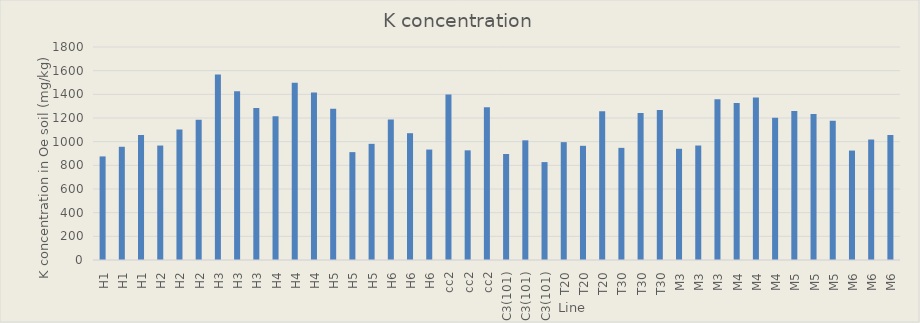
| Category | Series 0 |
|---|---|
| H1 | 875.34 |
| H1 | 956.953 |
| H1 | 1056.56 |
| H2 | 967.267 |
| H2 | 1102.268 |
| H2 | 1185.844 |
| H3 | 1567.822 |
| H3 | 1425.326 |
| H3 | 1283.853 |
| H4 | 1214.295 |
| H4 | 1497.702 |
| H4 | 1416.536 |
| H5 | 1278.962 |
| H5 | 911.667 |
| H5 | 981.686 |
| H6 | 1188.254 |
| H6 | 1071.49 |
| H6 | 933.397 |
| cc2 | 1398.912 |
| cc2 | 926.765 |
| cc2 | 1289.901 |
| C3(101) | 895.745 |
| C3(101) | 1011.337 |
| C3(101) | 827.401 |
| T20 | 995.967 |
| T20 | 965.038 |
| T20 | 1256.507 |
| T30 | 947.758 |
| T30 | 1241.948 |
| T30 | 1268.479 |
| M3 | 940.008 |
| M3 | 967.457 |
| M3 | 1359.427 |
| M4 | 1326.164 |
| M4 | 1372.339 |
| M4 | 1202.783 |
| M5 | 1258.207 |
| M5 | 1232.885 |
| M5 | 1177.102 |
| M6 | 924.842 |
| M6 | 1018.233 |
| M6 | 1056.268 |